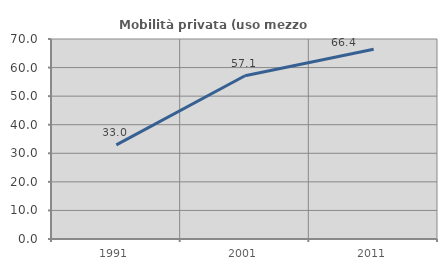
| Category | Mobilità privata (uso mezzo privato) |
|---|---|
| 1991.0 | 32.962 |
| 2001.0 | 57.143 |
| 2011.0 | 66.4 |